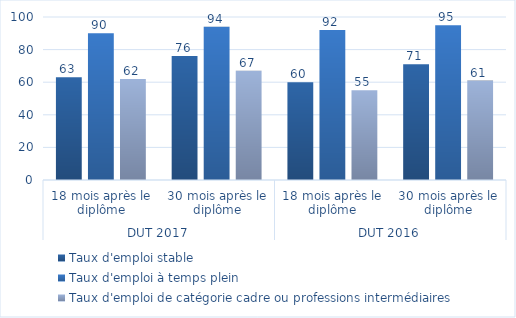
| Category | Taux d'emploi stable | Taux d'emploi à temps plein | Taux d'emploi de catégorie cadre ou professions intermédiaires |
|---|---|---|---|
| 0 | 63 | 90 | 62 |
| 1 | 76 | 94 | 67 |
| 2 | 60 | 92 | 55 |
| 3 | 71 | 95 | 61 |